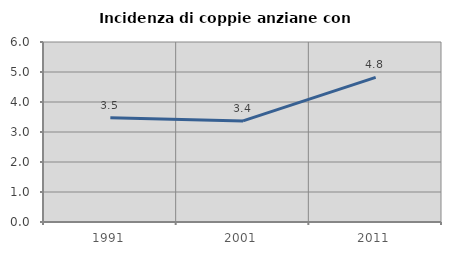
| Category | Incidenza di coppie anziane con figli |
|---|---|
| 1991.0 | 3.477 |
| 2001.0 | 3.369 |
| 2011.0 | 4.823 |